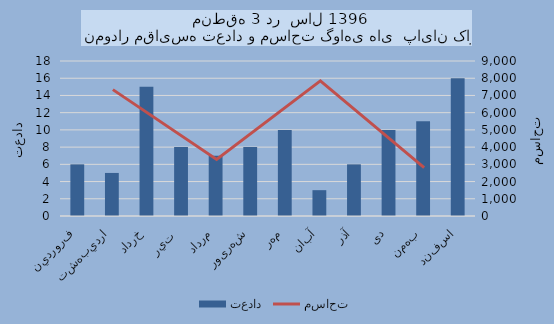
| Category | تعداد |
|---|---|
| فروردين | 6 |
| ارديبهشت | 5 |
| خرداد | 15 |
| تير  | 8 |
| مرداد | 7 |
| شهریور | 8 |
| مهر | 10 |
| آبان | 3 |
| آذر | 6 |
| دی | 10 |
| بهمن | 11 |
| اسفند | 16 |